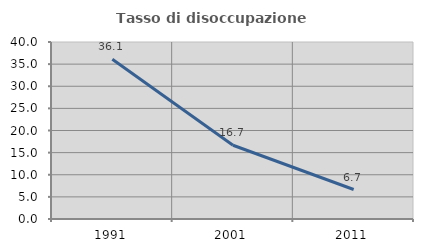
| Category | Tasso di disoccupazione giovanile  |
|---|---|
| 1991.0 | 36.111 |
| 2001.0 | 16.667 |
| 2011.0 | 6.667 |